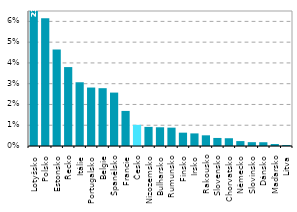
| Category | Series 0 |
|---|---|
| Lotyšsko | 0.231 |
| Polsko | 0.062 |
| Estonsko | 0.046 |
| Řecko | 0.038 |
| Itálie | 0.031 |
| Portugalsko | 0.028 |
| Belgie | 0.028 |
| Španělsko | 0.026 |
| Francie | 0.017 |
| Česko | 0.01 |
| Nizozemsko | 0.009 |
| Bulharsko | 0.009 |
| Rumunsko | 0.009 |
| Finsko | 0.006 |
| Irsko | 0.006 |
| Rakousko | 0.005 |
| Slovensko | 0.004 |
| Chorvatsko | 0.004 |
| Německo | 0.002 |
| Slovinsko | 0.002 |
| Dánsko | 0.002 |
| Maďarsko | 0.001 |
| Litva | 0 |